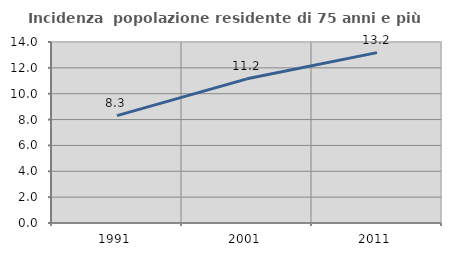
| Category | Incidenza  popolazione residente di 75 anni e più |
|---|---|
| 1991.0 | 8.303 |
| 2001.0 | 11.151 |
| 2011.0 | 13.177 |